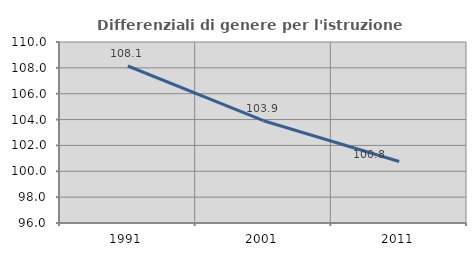
| Category | Differenziali di genere per l'istruzione superiore |
|---|---|
| 1991.0 | 108.143 |
| 2001.0 | 103.914 |
| 2011.0 | 100.756 |